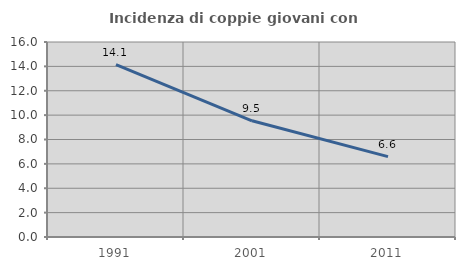
| Category | Incidenza di coppie giovani con figli |
|---|---|
| 1991.0 | 14.145 |
| 2001.0 | 9.536 |
| 2011.0 | 6.598 |